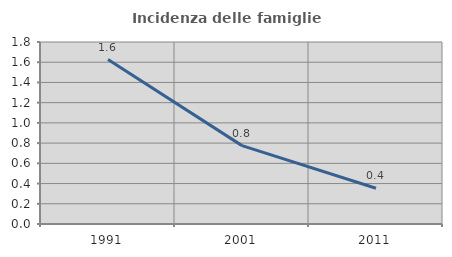
| Category | Incidenza delle famiglie numerose |
|---|---|
| 1991.0 | 1.626 |
| 2001.0 | 0.775 |
| 2011.0 | 0.353 |